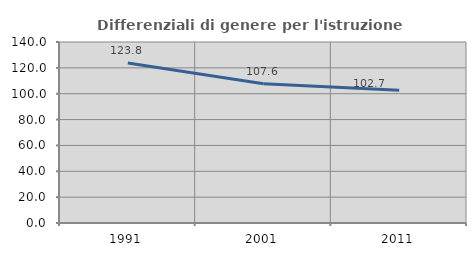
| Category | Differenziali di genere per l'istruzione superiore |
|---|---|
| 1991.0 | 123.752 |
| 2001.0 | 107.65 |
| 2011.0 | 102.701 |